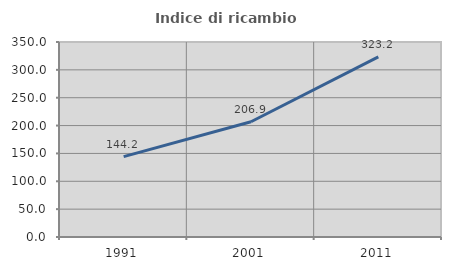
| Category | Indice di ricambio occupazionale  |
|---|---|
| 1991.0 | 144.219 |
| 2001.0 | 206.882 |
| 2011.0 | 323.198 |